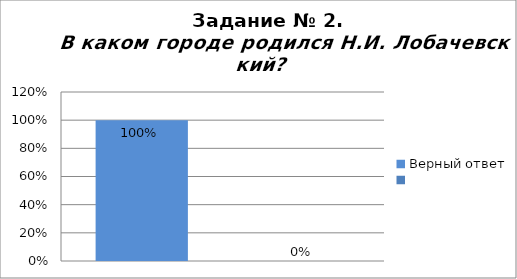
| Category | В каком городе родился Н.И. Лобачевский? |
|---|---|
| Верный ответ | 1 |